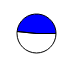
| Category | Series 0 |
|---|---|
| 0 | 10651521 |
| 1 | 9972902 |